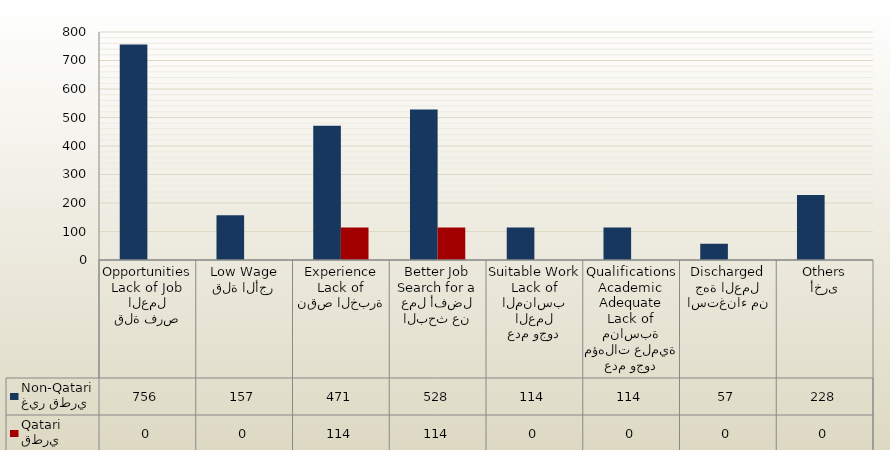
| Category | غير قطري
Non-Qatari | قطري
Qatari |
|---|---|---|
| قلة فرص العمل
Lack of Job Opportunities | 756 | 0 |
| قلة الأجر
Low Wage | 157 | 0 |
| نقص الخبرة
Lack of Experience | 471 | 114 |
| البحث عن عمل أفضل
Search for a Better Job | 528 | 114 |
| عدم وجود العمل المناسب
Lack of Suitable Work | 114 | 0 |
| عدم وجود مؤهلات علمية مناسبة
Lack of Adequate Academic Qualifications | 114 | 0 |
| استغناء من جهة العمل
Discharged | 57 | 0 |
| أخرى
Others | 228 | 0 |